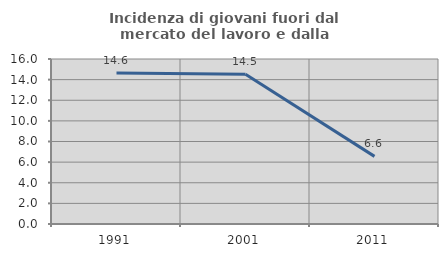
| Category | Incidenza di giovani fuori dal mercato del lavoro e dalla formazione  |
|---|---|
| 1991.0 | 14.634 |
| 2001.0 | 14.516 |
| 2011.0 | 6.557 |